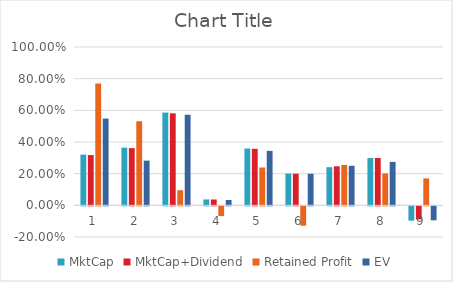
| Category | MktCap | MktCap+Dividend | Retained Profit | EV |
|---|---|---|---|---|
| 0 | 0.32 | 0.317 | 0.769 | 0.548 |
| 1 | 0.364 | 0.361 | 0.531 | 0.282 |
| 2 | 0.586 | 0.581 | 0.096 | 0.572 |
| 3 | 0.037 | 0.037 | -0.062 | 0.034 |
| 4 | 0.359 | 0.357 | 0.239 | 0.344 |
| 5 | 0.201 | 0.2 | -0.122 | 0.199 |
| 6 | 0.241 | 0.247 | 0.255 | 0.25 |
| 7 | 0.299 | 0.299 | 0.201 | 0.275 |
| 8 | -0.09 | -0.082 | 0.17 | -0.088 |